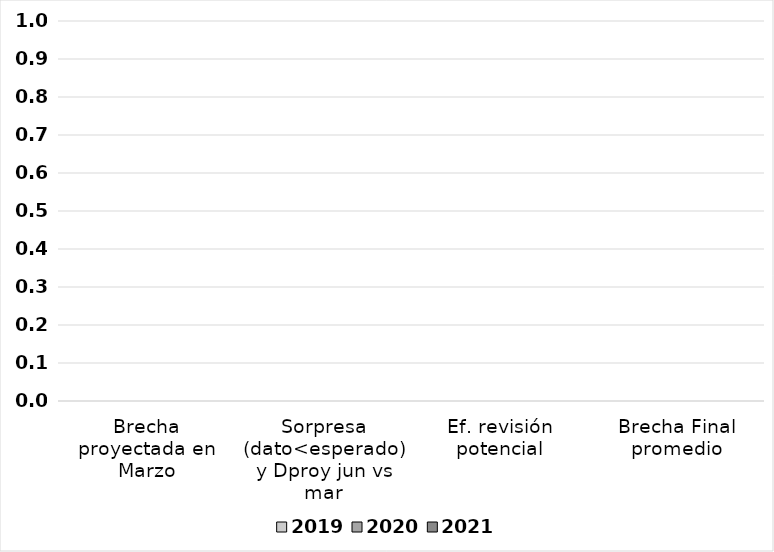
| Category | 2019 | 2020 | 2021 |
|---|---|---|---|
| Brecha proyectada en Marzo | 0 | 0 | 0 |
| Sorpresa (dato<esperado) y Dproy jun vs mar | 0 | 0 | 0 |
| Ef. revisión potencial | 0 | 0 | 0 |
| Brecha Final promedio | 0 | 0 | 0 |